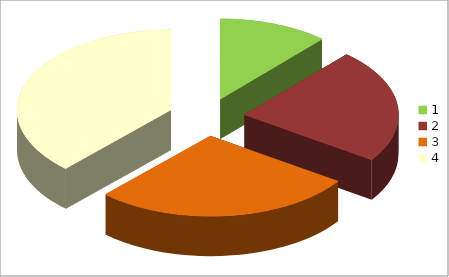
| Category | Series 0 |
|---|---|
| 0 | 11.504 |
| 1 | 23.009 |
| 2 | 27.434 |
| 3 | 38.053 |